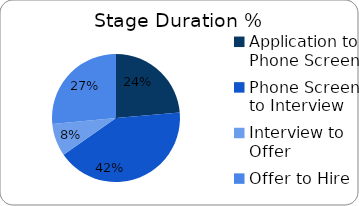
| Category | Series 0 |
|---|---|
| Application to Phone Screen | 12.5 |
| Phone Screen to Interview | 22 |
| Interview to Offer | 4.333 |
| Offer to Hire | 14 |